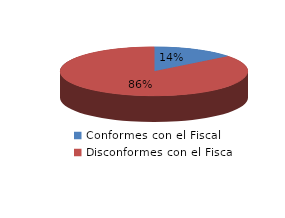
| Category | Series 0 |
|---|---|
| 0 | 3 |
| 1 | 18 |